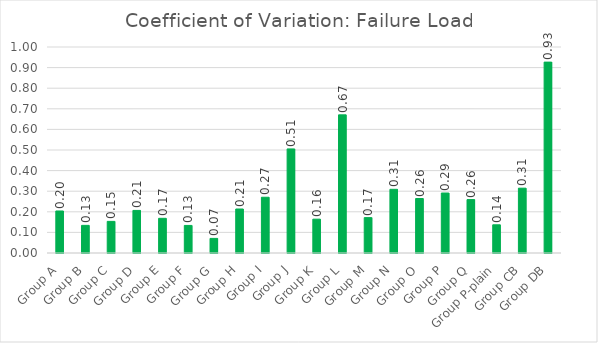
| Category | Coefficient of Variation |
|---|---|
| Group A | 0.204 |
| Group B | 0.134 |
| Group C | 0.153 |
| Group D | 0.207 |
| Group E | 0.168 |
| Group F | 0.134 |
| Group G | 0.071 |
| Group H | 0.214 |
| Group I | 0.271 |
| Group J | 0.505 |
| Group K | 0.164 |
| Group L | 0.671 |
| Group M | 0.172 |
| Group N | 0.309 |
| Group O | 0.264 |
| Group P | 0.291 |
| Group Q | 0.259 |
| Group P-plain | 0.137 |
| Group CB | 0.315 |
| Group DB | 0.927 |